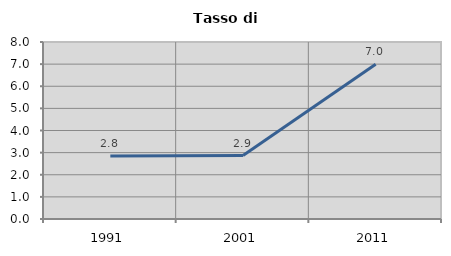
| Category | Tasso di disoccupazione   |
|---|---|
| 1991.0 | 2.848 |
| 2001.0 | 2.867 |
| 2011.0 | 6.993 |